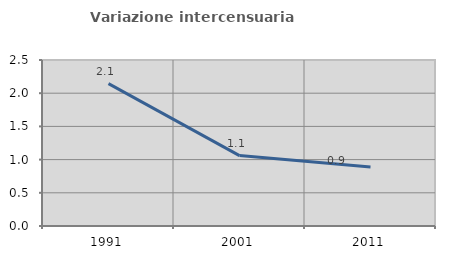
| Category | Variazione intercensuaria annua |
|---|---|
| 1991.0 | 2.143 |
| 2001.0 | 1.06 |
| 2011.0 | 0.888 |